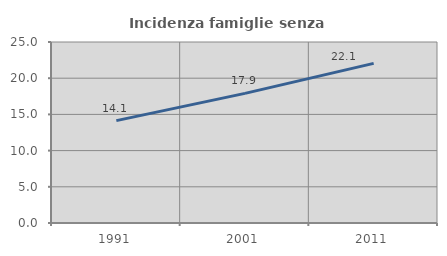
| Category | Incidenza famiglie senza nuclei |
|---|---|
| 1991.0 | 14.141 |
| 2001.0 | 17.908 |
| 2011.0 | 22.052 |